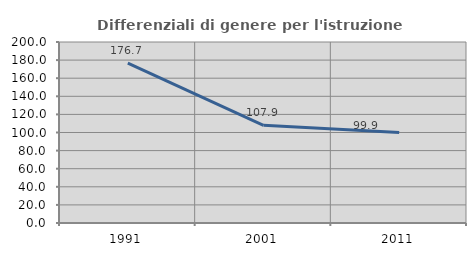
| Category | Differenziali di genere per l'istruzione superiore |
|---|---|
| 1991.0 | 176.667 |
| 2001.0 | 107.887 |
| 2011.0 | 99.934 |